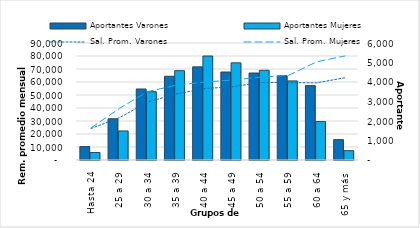
| Category | Aportantes Varones | Aportantes Mujeres |
|---|---|---|
| Hasta 24 | 689 | 386 |
| 25 a 29 | 2113 | 1490 |
| 30 a 34 | 3642 | 3503 |
| 35 a 39 | 4294 | 4582 |
| 40 a 44 | 4776 | 5333 |
| 45 a 49 | 4513 | 4983 |
| 50 a 54 | 4461 | 4601 |
| 55 a 59 | 4320 | 4056 |
| 60 a 64 | 3814 | 1971 |
| 65 y más | 1045 | 479 |